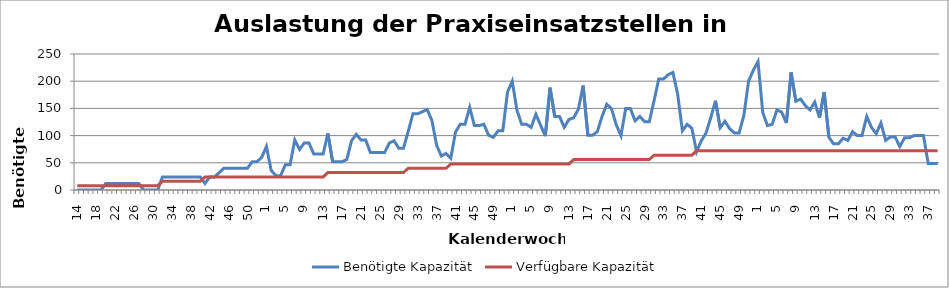
| Category | Benötigte Kapazität | Verfügbare Kapazität |
|---|---|---|
| 14.0 | 0 | 8 |
| 15.0 | 0 | 8 |
| 16.0 | 0 | 8 |
| 17.0 | 0 | 8 |
| 18.0 | 0 | 8 |
| 19.0 | 0 | 8 |
| 20.0 | 12 | 8 |
| 21.0 | 12 | 8 |
| 22.0 | 12 | 8 |
| 23.0 | 12 | 8 |
| 24.0 | 12 | 8 |
| 25.0 | 12 | 8 |
| 26.0 | 12 | 8 |
| 27.0 | 12 | 8 |
| 28.0 | 0 | 8 |
| 29.0 | 0 | 8 |
| 30.0 | 0 | 8 |
| 31.0 | 0 | 8 |
| 32.0 | 24 | 16 |
| 33.0 | 24 | 16 |
| 34.0 | 24 | 16 |
| 35.0 | 24 | 16 |
| 36.0 | 24 | 16 |
| 37.0 | 24 | 16 |
| 38.0 | 24 | 16 |
| 39.0 | 24 | 16 |
| 40.0 | 24 | 16 |
| 41.0 | 12 | 24 |
| 42.0 | 24 | 24 |
| 43.0 | 24 | 24 |
| 44.0 | 32 | 24 |
| 45.0 | 40 | 24 |
| 46.0 | 40 | 24 |
| 47.0 | 40 | 24 |
| 48.0 | 40 | 24 |
| 49.0 | 40 | 24 |
| 50.0 | 40 | 24 |
| 51.0 | 52 | 24 |
| 52.0 | 52 | 24 |
| 53.0 | 60 | 24 |
| 1.0 | 80 | 24 |
| 2.0 | 36 | 24 |
| 3.0 | 26.4 | 24 |
| 4.0 | 26.4 | 24 |
| 5.0 | 46.4 | 24 |
| 6.0 | 46.4 | 24 |
| 7.0 | 92 | 24 |
| 8.0 | 74.4 | 24 |
| 9.0 | 86.4 | 24 |
| 10.0 | 86.4 | 24 |
| 11.0 | 66.4 | 24 |
| 12.0 | 66.4 | 24 |
| 13.0 | 66.4 | 24 |
| 14.0 | 104 | 32 |
| 15.0 | 52 | 32 |
| 16.0 | 52 | 32 |
| 17.0 | 52 | 32 |
| 18.0 | 56 | 32 |
| 19.0 | 90.4 | 32 |
| 20.0 | 102.4 | 32 |
| 21.0 | 92 | 32 |
| 22.0 | 92 | 32 |
| 23.0 | 68.8 | 32 |
| 24.0 | 68.8 | 32 |
| 25.0 | 68.8 | 32 |
| 26.0 | 68.8 | 32 |
| 27.0 | 86.4 | 32 |
| 28.0 | 90.4 | 32 |
| 29.0 | 76.8 | 32 |
| 30.0 | 76.8 | 32 |
| 31.0 | 108 | 40 |
| 32.0 | 140 | 40 |
| 33.0 | 140 | 40 |
| 34.0 | 144 | 40 |
| 35.0 | 148 | 40 |
| 36.0 | 128 | 40 |
| 37.0 | 82.4 | 40 |
| 38.0 | 62.4 | 40 |
| 39.0 | 67.2 | 40 |
| 40.0 | 58.4 | 48 |
| 41.0 | 106.4 | 48 |
| 42.0 | 120.8 | 48 |
| 43.0 | 120.8 | 48 |
| 44.0 | 152 | 48 |
| 45.0 | 118.4 | 48 |
| 46.0 | 118.4 | 48 |
| 47.0 | 120.8 | 48 |
| 48.0 | 100.8 | 48 |
| 49.0 | 96.8 | 48 |
| 50.0 | 108.8 | 48 |
| 51.0 | 108.8 | 48 |
| 52.0 | 180 | 48 |
| 1.0 | 200 | 48 |
| 2.0 | 146.4 | 48 |
| 3.0 | 120.8 | 48 |
| 4.0 | 120.8 | 48 |
| 5.0 | 115.2 | 48 |
| 6.0 | 139.2 | 48 |
| 7.0 | 119.2 | 48 |
| 8.0 | 99.2 | 48 |
| 9.0 | 188 | 48 |
| 10.0 | 135.2 | 48 |
| 11.0 | 135.2 | 48 |
| 12.0 | 115.2 | 48 |
| 13.0 | 129.6 | 48 |
| 14.0 | 132.8 | 56 |
| 15.0 | 148.8 | 56 |
| 16.0 | 192 | 56 |
| 17.0 | 100.8 | 56 |
| 18.0 | 100.8 | 56 |
| 19.0 | 107.2 | 56 |
| 20.0 | 135.2 | 56 |
| 21.0 | 157.6 | 56 |
| 22.0 | 149.6 | 56 |
| 23.0 | 120 | 56 |
| 24.0 | 100 | 56 |
| 25.0 | 149.6 | 56 |
| 26.0 | 149.6 | 56 |
| 27.0 | 127.2 | 56 |
| 28.0 | 135.2 | 56 |
| 29.0 | 125.6 | 56 |
| 30.0 | 125.6 | 56 |
| 31.0 | 164 | 64 |
| 32.0 | 204 | 64 |
| 33.0 | 204 | 64 |
| 34.0 | 212 | 64 |
| 35.0 | 216 | 64 |
| 36.0 | 176 | 64 |
| 37.0 | 108.8 | 64 |
| 38.0 | 120.8 | 64 |
| 39.0 | 113.6 | 64 |
| 40.0 | 70.4 | 72 |
| 41.0 | 90.4 | 72 |
| 42.0 | 104.8 | 72 |
| 43.0 | 132.8 | 72 |
| 44.0 | 164 | 72 |
| 45.0 | 114.4 | 72 |
| 46.0 | 126.4 | 72 |
| 47.0 | 112.8 | 72 |
| 48.0 | 104.8 | 72 |
| 49.0 | 104.8 | 72 |
| 50.0 | 136.8 | 72 |
| 51.0 | 200 | 72 |
| 52.0 | 220 | 72 |
| 1.0 | 236 | 72 |
| 2.0 | 142.4 | 72 |
| 3.0 | 118.4 | 72 |
| 4.0 | 120.8 | 72 |
| 5.0 | 147.2 | 72 |
| 6.0 | 143.2 | 72 |
| 7.0 | 123.2 | 72 |
| 8.0 | 216 | 72 |
| 9.0 | 163.2 | 72 |
| 10.0 | 167.2 | 72 |
| 11.0 | 155.2 | 72 |
| 12.0 | 147.2 | 72 |
| 13.0 | 161.6 | 72 |
| 14.0 | 132.8 | 72 |
| 15.0 | 180 | 72 |
| 16.0 | 96.8 | 72 |
| 17.0 | 84.8 | 72 |
| 18.0 | 84.8 | 72 |
| 19.0 | 95.2 | 72 |
| 20.0 | 91.2 | 72 |
| 21.0 | 107.2 | 72 |
| 22.0 | 100 | 72 |
| 23.0 | 100 | 72 |
| 24.0 | 135.2 | 72 |
| 25.0 | 115.2 | 72 |
| 26.0 | 103.2 | 72 |
| 27.0 | 123.2 | 72 |
| 28.0 | 91.2 | 72 |
| 29.0 | 97.6 | 72 |
| 30.0 | 97.6 | 72 |
| 31.0 | 80 | 72 |
| 32.0 | 96 | 72 |
| 33.0 | 96 | 72 |
| 34.0 | 100 | 72 |
| 35.0 | 100 | 72 |
| 36.0 | 100 | 72 |
| 37.0 | 48.8 | 72 |
| 38.0 | 48.8 | 72 |
| 39.0 | 48.8 | 72 |